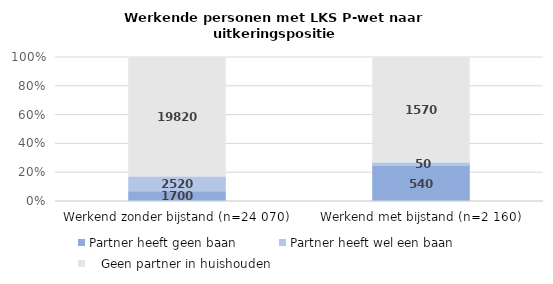
| Category | Partner heeft geen baan | Partner heeft wel een baan |    Geen partner in huishouden |
|---|---|---|---|
| Werkend zonder bijstand (n=24 070) | 1700 | 2520 | 19820 |
| Werkend met bijstand (n=2 160) | 540 | 50 | 1570 |